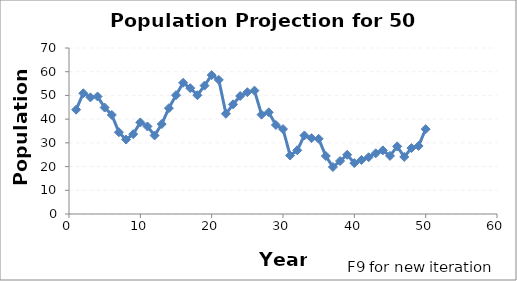
| Category | 1 |
|---|---|
| 1.0 | 44 |
| 2.0 | 50.914 |
| 3.0 | 49.175 |
| 4.0 | 49.553 |
| 5.0 | 44.878 |
| 6.0 | 41.779 |
| 7.0 | 34.479 |
| 8.0 | 31.383 |
| 9.0 | 33.67 |
| 10.0 | 38.622 |
| 11.0 | 36.916 |
| 12.0 | 33.12 |
| 13.0 | 37.933 |
| 14.0 | 44.625 |
| 15.0 | 50.097 |
| 16.0 | 55.339 |
| 17.0 | 53.074 |
| 18.0 | 50.094 |
| 19.0 | 54.147 |
| 20.0 | 58.571 |
| 21.0 | 56.557 |
| 22.0 | 42.258 |
| 23.0 | 46.24 |
| 24.0 | 49.757 |
| 25.0 | 51.358 |
| 26.0 | 52.022 |
| 27.0 | 41.895 |
| 28.0 | 42.872 |
| 29.0 | 37.552 |
| 30.0 | 35.829 |
| 31.0 | 24.671 |
| 32.0 | 26.87 |
| 33.0 | 33.121 |
| 34.0 | 31.967 |
| 35.0 | 31.708 |
| 36.0 | 24.447 |
| 37.0 | 19.801 |
| 38.0 | 22.337 |
| 39.0 | 24.975 |
| 40.0 | 21.454 |
| 41.0 | 22.785 |
| 42.0 | 23.932 |
| 43.0 | 25.6 |
| 44.0 | 26.826 |
| 45.0 | 24.497 |
| 46.0 | 28.519 |
| 47.0 | 24.066 |
| 48.0 | 27.804 |
| 49.0 | 28.708 |
| 50.0 | 35.791 |